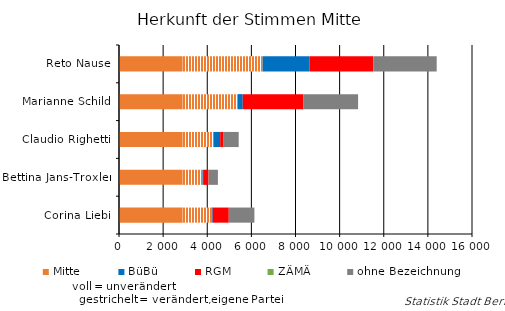
| Category | Mitte | verändert, eigene Liste | BüBü | RGM | ZÄMÄ | ohne Bezeichnung |
|---|---|---|---|---|---|---|
| Reto Nause | 2891 | 3618 | 2126 | 2878 | 12 | 2875 |
| Marianne Schild | 2891 | 2498 | 220 | 2755 | 7 | 2466 |
| Claudio Righetti | 2891 | 1390 | 305 | 130 | 3 | 707 |
| Bettina Jans-Troxler | 2891 | 893 | 28 | 246 | 7 | 418 |
| Corina Liebi | 2891 | 1317 | 40 | 728 | 2 | 1159 |